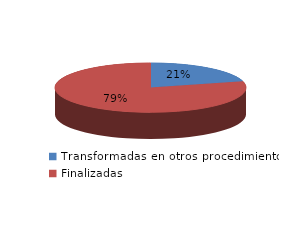
| Category | Series 0 |
|---|---|
| Transformadas en otros procedimientos | 2530 |
| Finalizadas | 9630 |